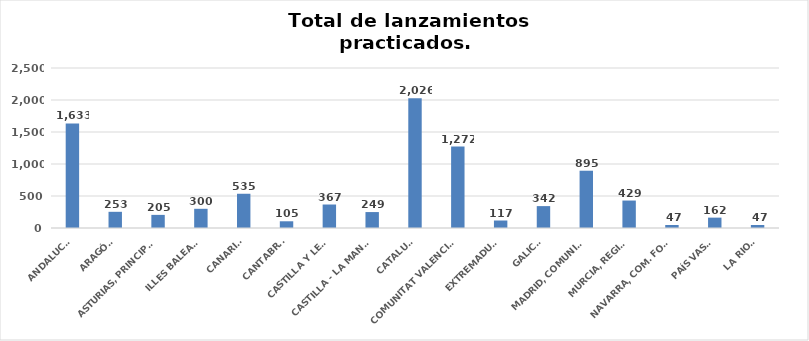
| Category | Series 0 |
|---|---|
| ANDALUCÍA | 1633 |
| ARAGÓN | 253 |
| ASTURIAS, PRINCIPADO | 205 |
| ILLES BALEARS | 300 |
| CANARIAS | 535 |
| CANTABRIA | 105 |
| CASTILLA Y LEÓN | 367 |
| CASTILLA - LA MANCHA | 249 |
| CATALUÑA | 2026 |
| COMUNITAT VALENCIANA | 1272 |
| EXTREMADURA | 117 |
| GALICIA | 342 |
| MADRID, COMUNIDAD | 895 |
| MURCIA, REGIÓN | 429 |
| NAVARRA, COM. FORAL | 47 |
| PAÍS VASCO | 162 |
| LA RIOJA | 47 |